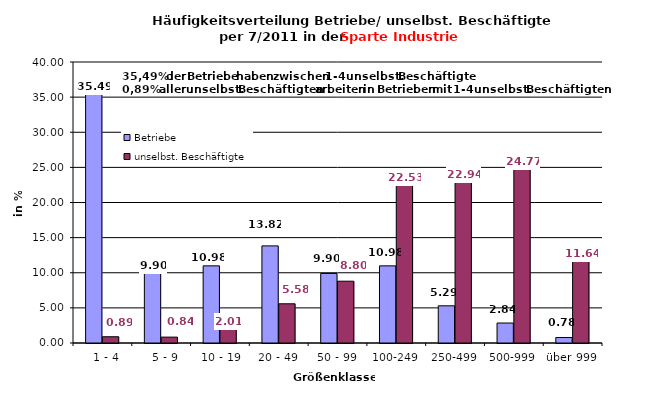
| Category | Betriebe | unselbst. Beschäftigte |
|---|---|---|
|   1 - 4 | 35.49 | 0.891 |
|   5 - 9 | 9.902 | 0.837 |
|  10 - 19 | 10.98 | 2.013 |
| 20 - 49 | 13.824 | 5.582 |
| 50 - 99 | 9.902 | 8.798 |
| 100-249 | 10.98 | 22.534 |
| 250-499 | 5.294 | 22.935 |
| 500-999 | 2.843 | 24.774 |
| über 999 | 0.784 | 11.636 |